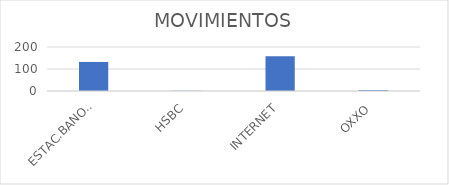
| Category | MOVIMIENTOS |
|---|---|
| ESTAC.BANORTE | 132 |
| HSBC | 1 |
| INTERNET | 158 |
| OXXO | 4 |